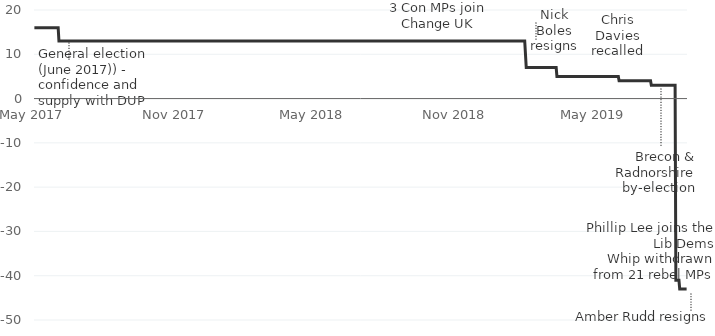
| Category | Conservative majority (including DUP) |
|---|---|
| 2017-05-20 | 16 |
| 2017-06-20 | 16 |
| 2017-06-21 | 13 |
| 2017-07-09 | 13 |
| 2017-07-10 | 13 |
| 2017-10-24 | 13 |
| 2017-10-25 | 13 |
| 2017-11-01 | 13 |
| 2017-11-02 | 13 |
| 2017-11-03 | 13 |
| 2017-11-22 | 13 |
| 2017-11-23 | 13 |
| 2017-12-11 | 13 |
| 2017-12-12 | 13 |
| 2018-04-29 | 13 |
| 2018-04-30 | 13 |
| 2018-05-02 | 13 |
| 2018-05-03 | 13 |
| 2018-05-08 | 13 |
| 2018-05-09 | 13 |
| 2018-06-13 | 13 |
| 2018-06-14 | 13 |
| 2018-07-02 | 13 |
| 2018-07-03 | 13 |
| 2018-07-11 | 13 |
| 2018-07-12 | 13 |
| 2018-07-17 | 13 |
| 2018-07-18 | 13 |
| 2018-07-23 | 13 |
| 2018-07-24 | 13 |
| 2018-08-20 | 13 |
| 2018-08-21 | 13 |
| 2018-08-29 | 13 |
| 2018-08-30 | 13 |
| 2018-11-20 | 13 |
| 2018-11-21 | 13 |
| 2018-12-05 | 13 |
| 2018-12-06 | 13 |
| 2018-12-11 | 13 |
| 2018-12-12 | 13 |
| 2018-12-18 | 13 |
| 2018-12-19 | 13 |
| 2018-12-20 | 13 |
| 2019-02-16 | 13 |
| 2019-02-17 | 13 |
| 2019-02-18 | 13 |
| 2019-02-19 | 13 |
| 2019-02-20 | 7 |
| 2019-02-21 | 7 |
| 2019-02-22 | 7 |
| 2019-02-26 | 7 |
| 2019-02-27 | 7 |
| 2019-03-31 | 7 |
| 2019-04-01 | 5 |
| 2019-04-03 | 5 |
| 2019-04-04 | 5 |
| 2019-04-30 | 5 |
| 2019-05-01 | 5 |
| 2019-06-03 | 5 |
| 2019-06-04 | 5 |
| 2019-06-05 | 5 |
| 2019-06-06 | 5 |
| 2019-06-12 | 5 |
| 2019-06-13 | 5 |
| 2019-06-20 | 5 |
| 2019-06-21 | 4 |
| 2019-07-10 | 4 |
| 2019-08-01 | 4 |
| 2019-08-02 | 3 |
| 2019-08-15 | 3 |
| 2019-09-02 | 3 |
| 2019-09-03 | -41 |
| 2019-09-04 | -41 |
| 2019-09-07 | -41 |
| 2019-09-08 | -43 |
| 2019-09-17 | -43 |